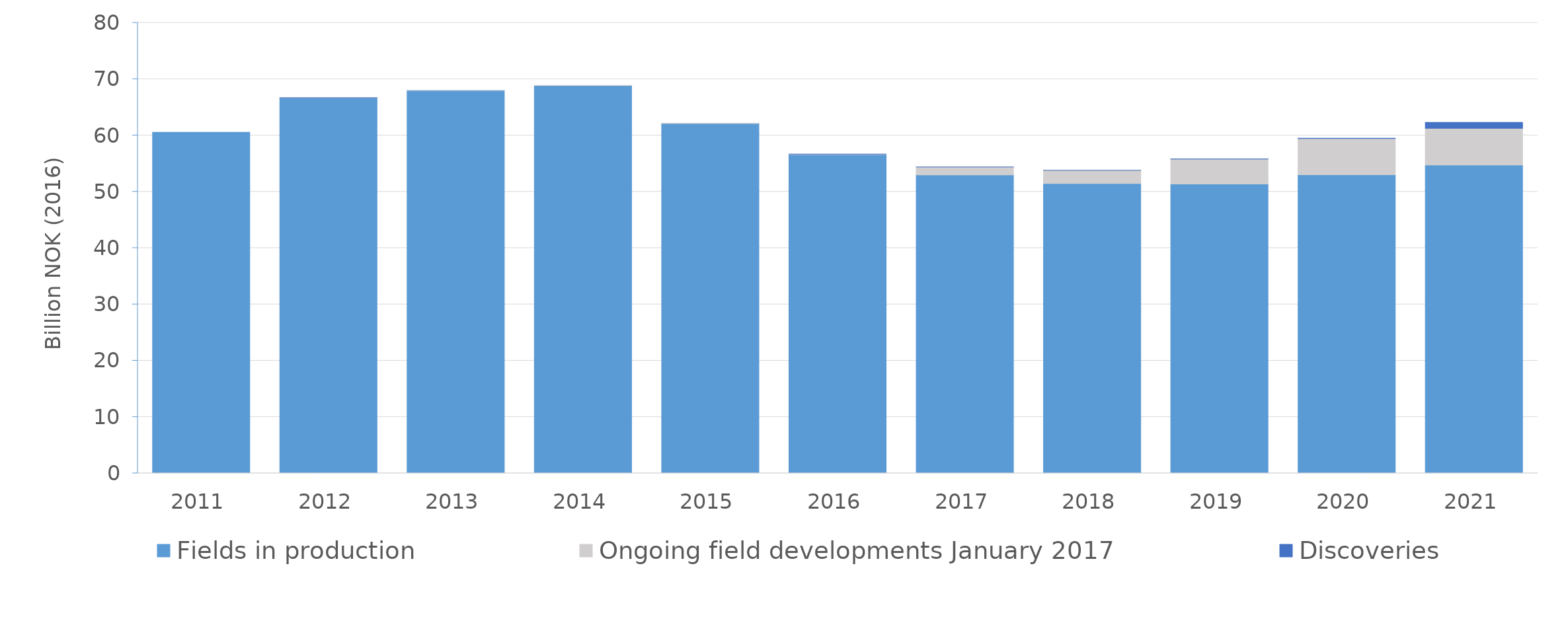
| Category | Fields in production | Ongoing field developments January 2017 | Discoveries |
|---|---|---|---|
| 2011.0 | 60.569 | 0 | 0 |
| 2012.0 | 66.679 | 0.007 | 0.001 |
| 2013.0 | 67.976 | 0.009 | 0 |
| 2014.0 | 68.866 | 0.014 | 0 |
| 2015.0 | 62.1 | 0.033 | 0 |
| 2016.0 | 56.592 | 0.092 | 0.003 |
| 2017.0 | 52.98 | 1.42 | 0.003 |
| 2018.0 | 51.473 | 2.332 | 0.01 |
| 2019.0 | 51.373 | 4.44 | 0.018 |
| 2020.0 | 53.032 | 6.415 | 0.044 |
| 2021.0 | 54.763 | 6.491 | 1.051 |